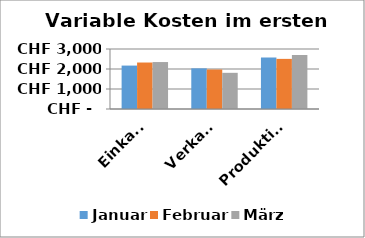
| Category | Januar | Februar | März |
|---|---|---|---|
| Einkauf | 2171 | 2324 | 2348 |
| Verkauf | 2033 | 1975 | 1809 |
| Produktion | 2576 | 2506 | 2703 |